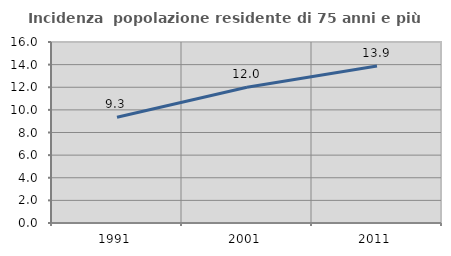
| Category | Incidenza  popolazione residente di 75 anni e più |
|---|---|
| 1991.0 | 9.343 |
| 2001.0 | 12 |
| 2011.0 | 13.871 |